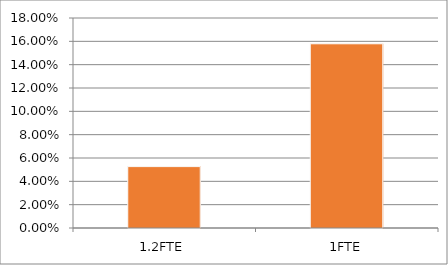
| Category | Series 0 |
|---|---|
| 1.2FTE | 0.053 |
| 1FTE | 0.158 |